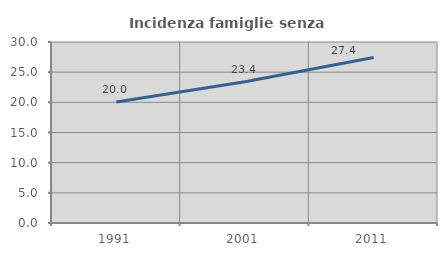
| Category | Incidenza famiglie senza nuclei |
|---|---|
| 1991.0 | 20.043 |
| 2001.0 | 23.421 |
| 2011.0 | 27.445 |